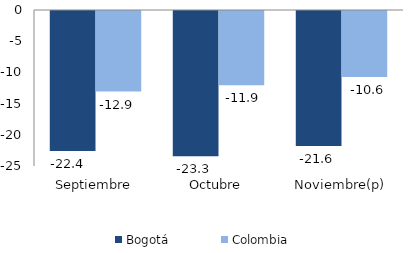
| Category | Bogotá | Colombia |
|---|---|---|
| Septiembre | -22.44 | -12.92 |
| Octubre | -23.271 | -11.893 |
| Noviembre(p) | -21.633 | -10.564 |